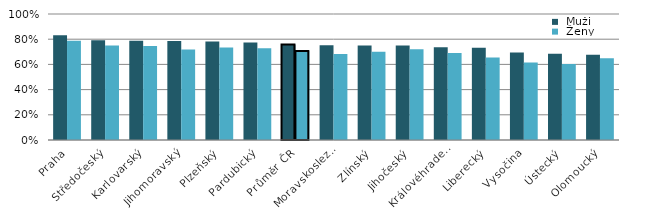
| Category |  Muži |  Ženy |
|---|---|---|
|   Praha | 0.831 | 0.788 |
|   Středočeský | 0.792 | 0.749 |
|   Karlovarský | 0.788 | 0.745 |
|   Jihomoravský | 0.785 | 0.719 |
|   Plzeňský | 0.782 | 0.734 |
|   Pardubický | 0.774 | 0.729 |
| Průměr ČR | 0.759 | 0.706 |
|   Moravskoslezský | 0.752 | 0.683 |
|   Zlínský | 0.75 | 0.701 |
|   Jihočeský | 0.75 | 0.72 |
|   Královéhradecký | 0.736 | 0.691 |
|   Liberecký | 0.731 | 0.656 |
|   Vysočina | 0.694 | 0.615 |
|   Ústecký | 0.685 | 0.603 |
|   Olomoucký | 0.676 | 0.648 |